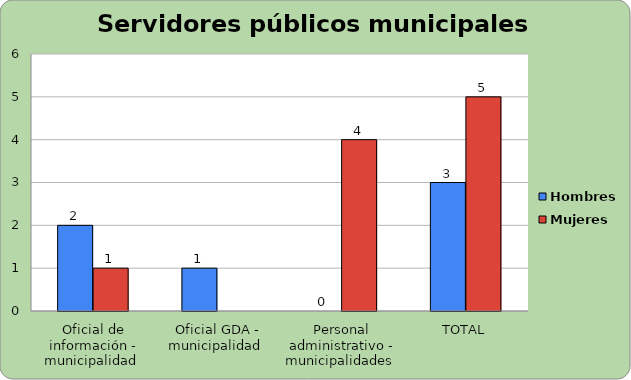
| Category | Hombres | Mujeres |
|---|---|---|
| Oficial de información - municipalidad  | 2 | 1 |
| Oficial GDA - municipalidad  | 1 | 0 |
| Personal administrativo - municipalidades  | 0 | 4 |
| TOTAL | 3 | 5 |